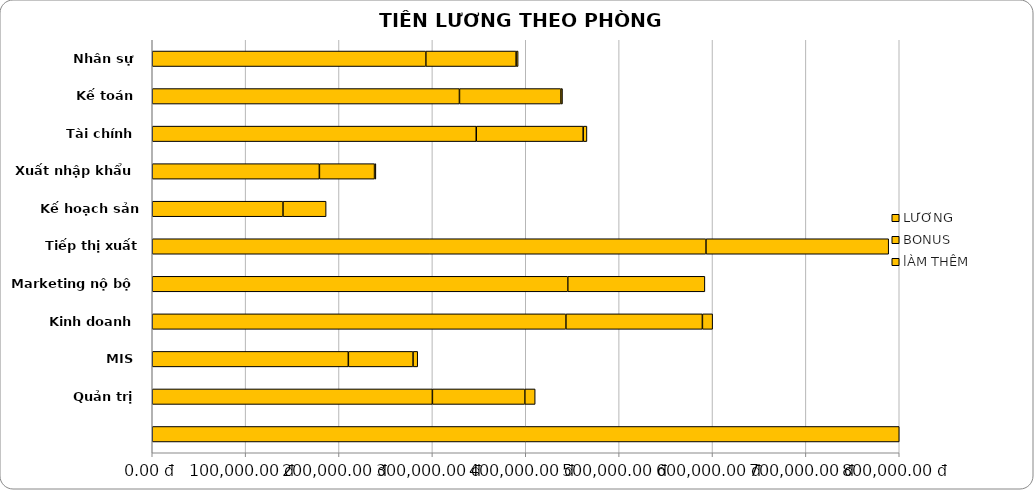
| Category | LƯƠNG | BONUS | lÀM THÊM |
|---|---|---|---|
| Nhân sự | 293000 | 96690 | 2156 |
| Kế toán | 329000 | 108570 | 1804 |
| Tài chính | 347000 | 114510 | 4004 |
| Xuất nhập khẩu | 179000 | 59070 | 1430 |
| Kế hoạch sản xuất | 140000 | 46200 | 0 |
| Tiếp thị xuất khẩu | 593000 | 195690 | 0 |
| Marketing nộ bộ | 445000 | 146850 | 0 |
| Kinh doanh | 443000 | 146190 | 10960 |
| MIS | 210000 | 69300 | 5000 |
| Quản trị | 300000 | 99000 | 11100 |